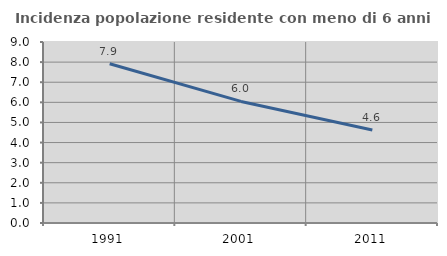
| Category | Incidenza popolazione residente con meno di 6 anni |
|---|---|
| 1991.0 | 7.92 |
| 2001.0 | 6.045 |
| 2011.0 | 4.62 |